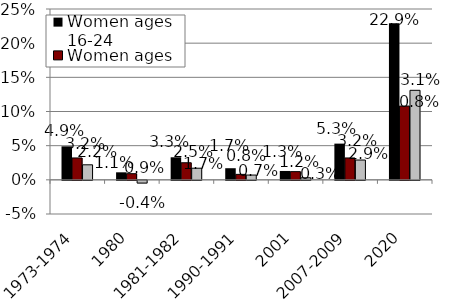
| Category | Women ages 16-24 | Women ages 25-54 | Women ages 55+ |
|---|---|---|---|
| 1973-1974 | 0.049 | 0.032 | 0.022 |
| 1980 | 0.011 | 0.009 | -0.004 |
| 1981-1982 | 0.033 | 0.025 | 0.017 |
| 1990-1991 | 0.017 | 0.008 | 0.007 |
| 2001 | 0.013 | 0.012 | 0.003 |
| 2007-2009 | 0.053 | 0.032 | 0.029 |
| 2020 | 0.229 | 0.108 | 0.131 |